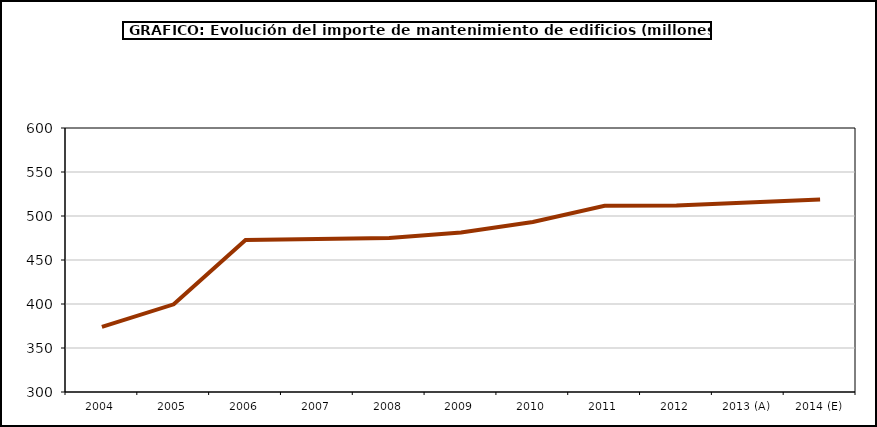
| Category | mantenimiento |
|---|---|
| 2004 | 373.998 |
| 2005 | 399.648 |
| 2006 | 472.777 |
| 2007 | 473.87 |
| 2008 | 474.915 |
| 2009 | 481.186 |
| 2010 | 493.233 |
| 2011 | 511.585 |
| 2012 | 512.04 |
| 2013 (A) | 515.387 |
| 2014 (E) | 518.678 |